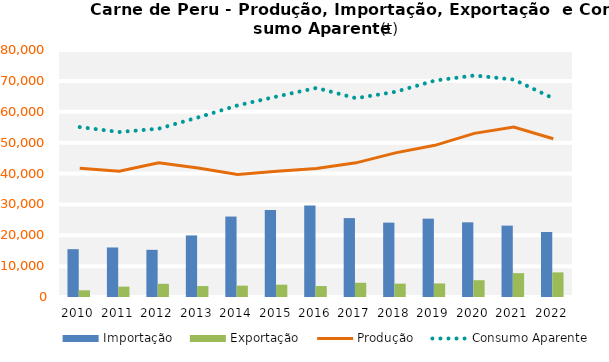
| Category | Importação | Exportação |
|---|---|---|
| 0 | 15493.337 | 2174.986 |
| 1 | 16041.72 | 3353.061 |
| 2 | 15277.635 | 4269.772 |
| 3 | 19944.059 | 3546.823 |
| 4 | 26053.496 | 3677.021 |
| 5 | 28196.242 | 3989.562 |
| 6 | 29657.221 | 3551.641 |
| 7 | 25553.862 | 4609.036 |
| 8 | 24088.437 | 4329.278 |
| 9 | 25375.971 | 4397.425 |
| 10 | 24187.606 | 5437.663 |
| 11 | 23118.384 | 7728.582 |
| 12 | 21064.836 | 7971.241 |